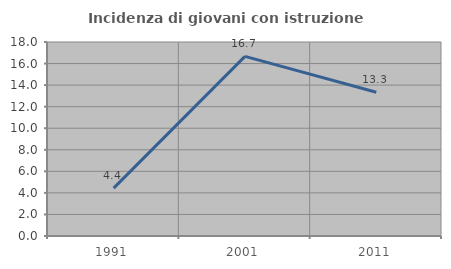
| Category | Incidenza di giovani con istruzione universitaria |
|---|---|
| 1991.0 | 4.444 |
| 2001.0 | 16.667 |
| 2011.0 | 13.333 |